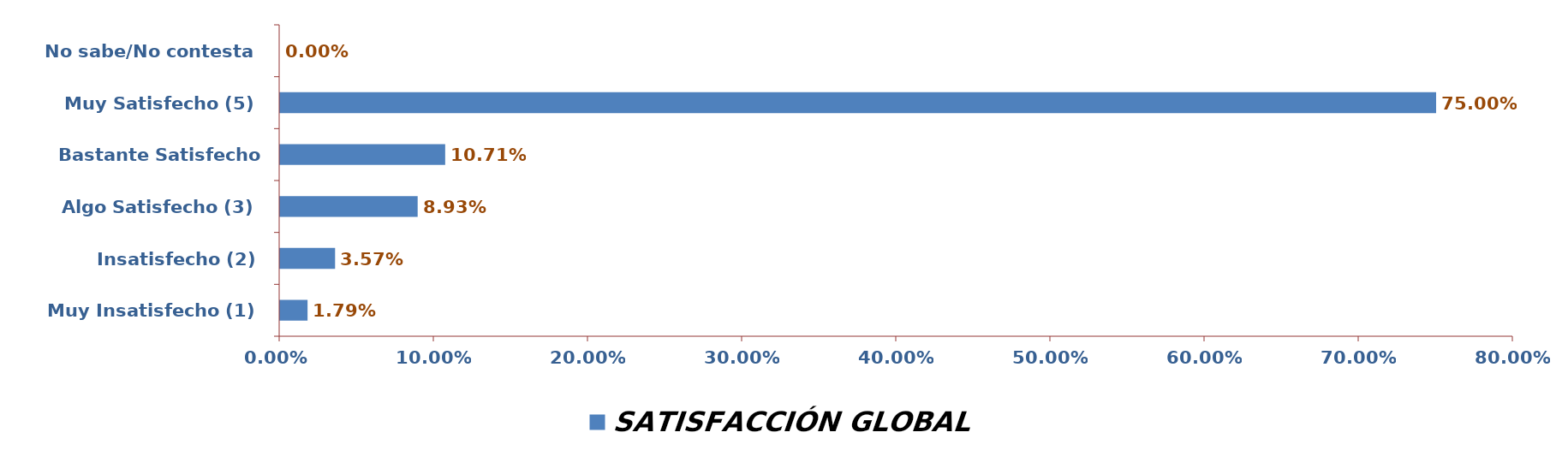
| Category | SATISFACCIÓN GLOBAL |
|---|---|
| Muy Insatisfecho (1) | 0.018 |
| Insatisfecho (2) | 0.036 |
| Algo Satisfecho (3) | 0.089 |
| Bastante Satisfecho (4) | 0.107 |
| Muy Satisfecho (5) | 0.75 |
| No sabe/No contesta | 0 |